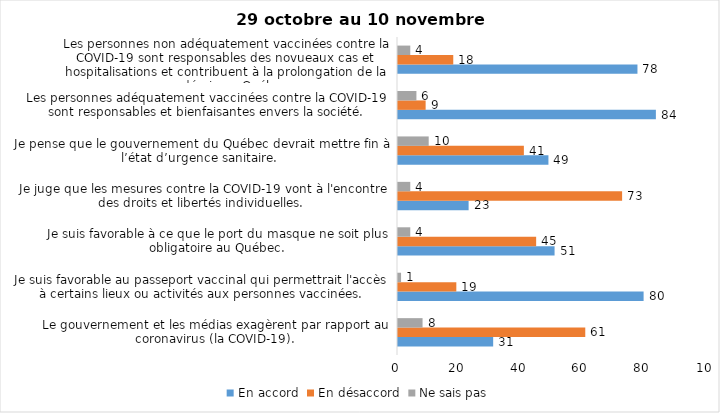
| Category | En accord | En désaccord | Ne sais pas |
|---|---|---|---|
| Le gouvernement et les médias exagèrent par rapport au coronavirus (la COVID-19). | 31 | 61 | 8 |
| Je suis favorable au passeport vaccinal qui permettrait l'accès à certains lieux ou activités aux personnes vaccinées. | 80 | 19 | 1 |
| Je suis favorable à ce que le port du masque ne soit plus obligatoire au Québec. | 51 | 45 | 4 |
| Je juge que les mesures contre la COVID-19 vont à l'encontre des droits et libertés individuelles.  | 23 | 73 | 4 |
| Je pense que le gouvernement du Québec devrait mettre fin à l’état d’urgence sanitaire.  | 49 | 41 | 10 |
| Les personnes adéquatement vaccinées contre la COVID-19 sont responsables et bienfaisantes envers la société. | 84 | 9 | 6 |
| Les personnes non adéquatement vaccinées contre la COVID-19 sont responsables des novueaux cas et hospitalisations et contribuent à la prolongation de la pandémie au Québec. | 78 | 18 | 4 |